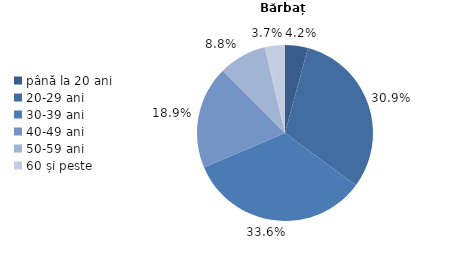
| Category | Series 0 |
|---|---|
| până la 20 ani | 4.2 |
| 20-29 ani | 30.9 |
| 30-39 ani | 33.5 |
| 40-49 ani | 18.9 |
| 50-59 ani | 8.8 |
| 60 și peste | 3.7 |